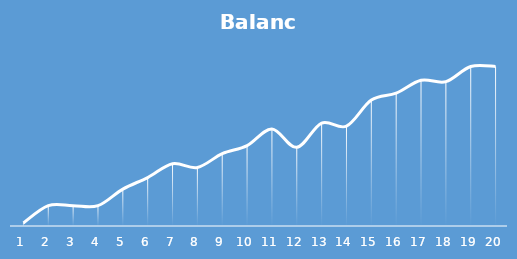
| Category | Balance |
|---|---|
| 0 | 27 |
| 1 | 177 |
| 2 | 177 |
| 3 | 177 |
| 4 | 321 |
| 5 | 421 |
| 6 | 541 |
| 7 | 509 |
| 8 | 629 |
| 9 | 699 |
| 10 | 844 |
| 11 | 684 |
| 12 | 895 |
| 13 | 868 |
| 14 | 1095 |
| 15 | 1155 |
| 16 | 1267 |
| 17 | 1255 |
| 18 | 1387 |
| 19 | 1387 |